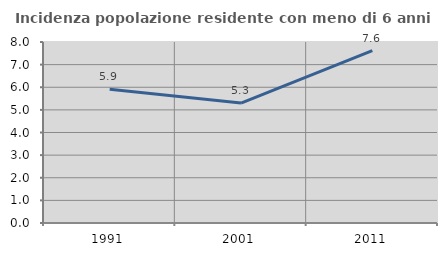
| Category | Incidenza popolazione residente con meno di 6 anni |
|---|---|
| 1991.0 | 5.908 |
| 2001.0 | 5.303 |
| 2011.0 | 7.614 |